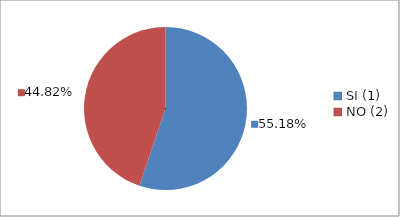
| Category | Series 0 |
|---|---|
| SI (1) | 0.552 |
| NO (2) | 0.448 |